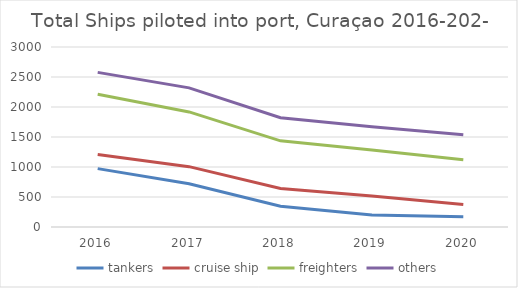
| Category | tankers | cruise ship | freighters | others |
|---|---|---|---|---|
| 2016.0 | 973 | 235 | 1003 | 366 |
| 2017.0 | 720 | 286 | 912 | 401 |
| 2018.0 | 345 | 298 | 793 | 386 |
| 2019.0 | 199 | 316 | 770 | 385 |
| 2020.0 | 171 | 205 | 745 | 417 |